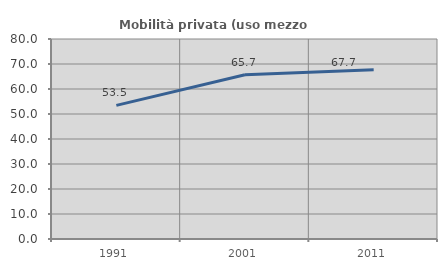
| Category | Mobilità privata (uso mezzo privato) |
|---|---|
| 1991.0 | 53.462 |
| 2001.0 | 65.687 |
| 2011.0 | 67.676 |